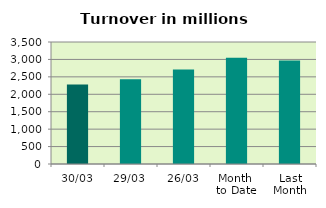
| Category | Series 0 |
|---|---|
| 30/03 | 2280.603 |
| 29/03 | 2431.928 |
| 26/03 | 2712.223 |
| Month 
to Date | 3049.027 |
| Last
Month | 2972.107 |